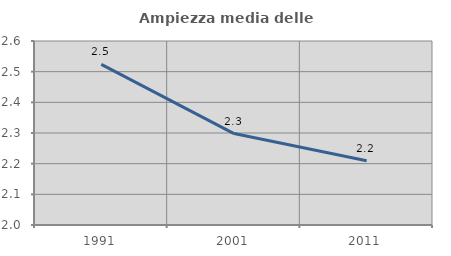
| Category | Ampiezza media delle famiglie |
|---|---|
| 1991.0 | 2.524 |
| 2001.0 | 2.298 |
| 2011.0 | 2.209 |